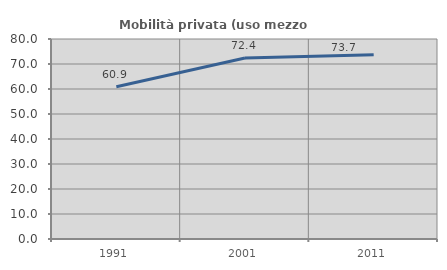
| Category | Mobilità privata (uso mezzo privato) |
|---|---|
| 1991.0 | 60.935 |
| 2001.0 | 72.378 |
| 2011.0 | 73.669 |